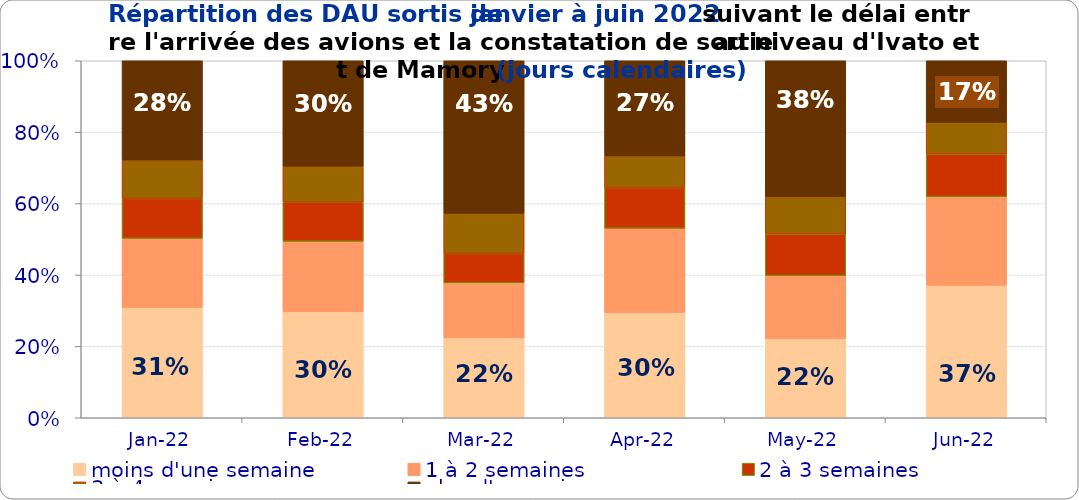
| Category | moins d'une semaine | 1 à 2 semaines | 2 à 3 semaines | 3 à 4 semaines | plus d'un mois |
|---|---|---|---|---|---|
| 2022-01-01 | 0.309 | 0.194 | 0.112 | 0.108 | 0.278 |
| 2022-02-01 | 0.297 | 0.197 | 0.109 | 0.101 | 0.295 |
| 2022-03-01 | 0.224 | 0.154 | 0.082 | 0.113 | 0.427 |
| 2022-04-01 | 0.295 | 0.236 | 0.114 | 0.089 | 0.266 |
| 2022-05-01 | 0.222 | 0.177 | 0.117 | 0.105 | 0.38 |
| 2022-06-01 | 0.371 | 0.248 | 0.12 | 0.089 | 0.172 |